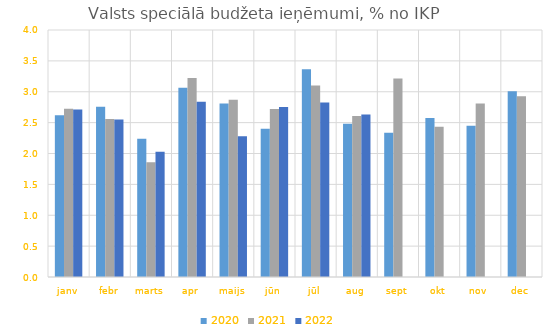
| Category | 2020 | 2021 | 2022 |
|---|---|---|---|
| janv | 2.62 | 2.724 | 2.712 |
| febr | 2.756 | 2.561 | 2.552 |
| marts | 2.241 | 1.858 | 2.029 |
| apr | 3.064 | 3.221 | 2.84 |
| maijs | 2.809 | 2.869 | 2.278 |
| jūn | 2.401 | 2.721 | 2.753 |
| jūl | 3.366 | 3.102 | 2.827 |
| aug | 2.481 | 2.607 | 2.631 |
| sept | 2.336 | 3.215 | 0 |
| okt | 2.575 | 2.432 | 0 |
| nov | 2.45 | 2.808 | 0 |
| dec | 3.008 | 2.925 | 0 |